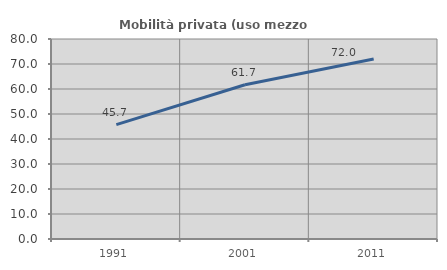
| Category | Mobilità privata (uso mezzo privato) |
|---|---|
| 1991.0 | 45.738 |
| 2001.0 | 61.694 |
| 2011.0 | 71.962 |